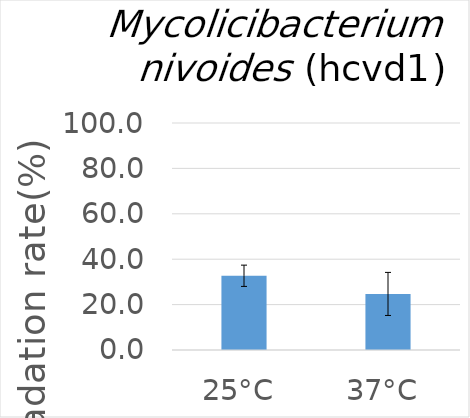
| Category | Series 0 |
|---|---|
| 25°C | 32.7 |
| 37°C | 24.702 |